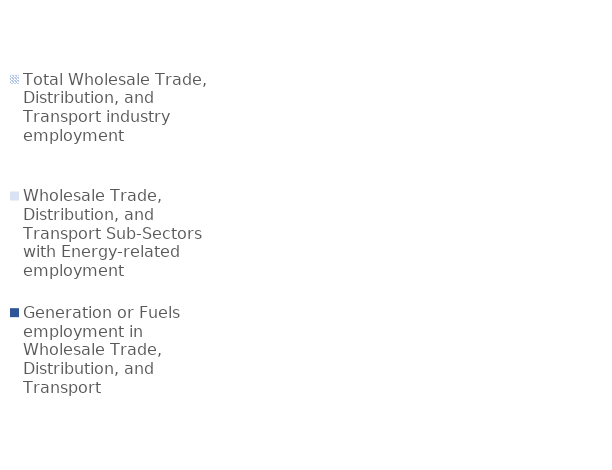
| Category | Total Wholesale Trade, Distribution, and Transport industry employment | Wholesale Trade, Distribution, and Transport Sub-Sectors with Energy-related employment | Generation or Fuels employment in Wholesale Trade, Distribution, and Transport |
|---|---|---|---|
| Generation | 8075494.184 | 2639852.184 | 130514.629 |
| Fuels | 8075494.184 | 2639852.184 | 166282.552 |